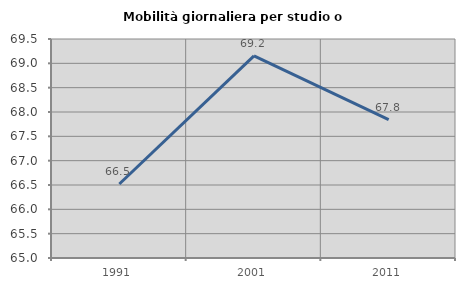
| Category | Mobilità giornaliera per studio o lavoro |
|---|---|
| 1991.0 | 66.52 |
| 2001.0 | 69.154 |
| 2011.0 | 67.842 |